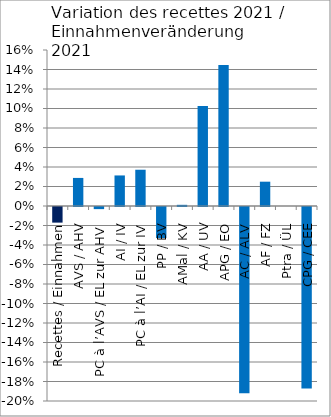
| Category | Series 0 |
|---|---|
| Recettes / Einnahmen | -0.016 |
| AVS / AHV | 0.029 |
| PC à l’AVS / EL zur AHV | -0.002 |
| AI / IV | 0.031 |
| PC à l’AI / EL zur IV | 0.037 |
| PP / BV | -0.032 |
| AMal / KV | 0.001 |
| AA / UV | 0.103 |
| APG / EO | 0.145 |
| AC / ALV | -0.191 |
| AF / FZ | 0.025 |
| Ptra / ÜL | 0 |
| CPG / CEE | -0.186 |